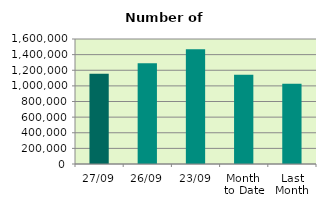
| Category | Series 0 |
|---|---|
| 27/09 | 1154560 |
| 26/09 | 1290800 |
| 23/09 | 1469694 |
| Month 
to Date | 1143809.895 |
| Last
Month | 1026775.304 |